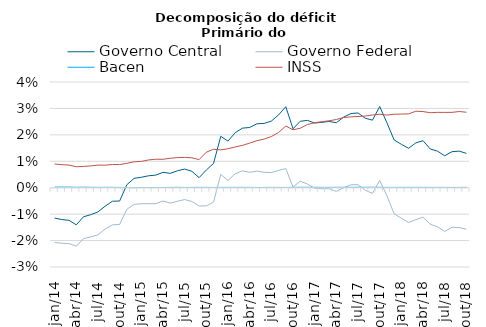
| Category | Governo Central | Governo Federal | Bacen | INSS |
|---|---|---|---|---|
| jan/14 | -0.011 | -0.021 | 0 | 0.009 |
| fev/14 | -0.012 | -0.021 | 0 | 0.009 |
| mar/14 | -0.012 | -0.021 | 0 | 0.009 |
| abr/14 | -0.014 | -0.022 | 0 | 0.008 |
| mai/14 | -0.011 | -0.019 | 0 | 0.008 |
| jun/14 | -0.01 | -0.019 | 0 | 0.008 |
| jul/14 | -0.009 | -0.018 | 0 | 0.009 |
| ago/14 | -0.007 | -0.016 | 0 | 0.009 |
| set/14 | -0.005 | -0.014 | 0 | 0.009 |
| out/14 | -0.005 | -0.014 | 0 | 0.009 |
| nov/14 | 0.001 | -0.008 | 0 | 0.009 |
| dez/14 | 0.004 | -0.006 | 0 | 0.01 |
| jan/15 | 0.004 | -0.006 | 0 | 0.01 |
| fev/15 | 0.005 | -0.006 | 0 | 0.011 |
| mar/15 | 0.005 | -0.006 | 0 | 0.011 |
| abr/15 | 0.006 | -0.005 | 0 | 0.011 |
| mai/15 | 0.005 | -0.006 | 0 | 0.011 |
| jun/15 | 0.006 | -0.005 | 0 | 0.011 |
| jul/15 | 0.007 | -0.004 | 0 | 0.011 |
| ago/15 | 0.006 | -0.005 | 0 | 0.011 |
| set/15 | 0.004 | -0.007 | 0 | 0.011 |
| out/15 | 0.007 | -0.007 | 0 | 0.013 |
| nov/15 | 0.009 | -0.005 | 0 | 0.015 |
| dez/15 | 0.019 | 0.005 | 0 | 0.014 |
| jan/16 | 0.018 | 0.003 | 0 | 0.015 |
| fev/16 | 0.021 | 0.005 | 0 | 0.015 |
| mar/16 | 0.023 | 0.006 | 0 | 0.016 |
| abr/16 | 0.023 | 0.006 | 0 | 0.017 |
| mai/16 | 0.024 | 0.006 | 0 | 0.018 |
| jun/16 | 0.024 | 0.006 | 0 | 0.018 |
| jul/16 | 0.025 | 0.006 | 0 | 0.019 |
| ago/16 | 0.028 | 0.007 | 0 | 0.021 |
| set/16 | 0.031 | 0.007 | 0 | 0.023 |
| out/16 | 0.022 | 0 | 0 | 0.022 |
| nov/16 | 0.025 | 0.002 | 0 | 0.022 |
| dez/16 | 0.025 | 0.001 | 0 | 0.024 |
| jan/17 | 0.024 | 0 | 0 | 0.025 |
| fev/17 | 0.025 | 0 | 0 | 0.025 |
| mar/17 | 0.025 | 0 | 0 | 0.025 |
| abr/17 | 0.025 | -0.001 | 0 | 0.026 |
| mai/17 | 0.027 | 0 | 0 | 0.027 |
| jun/17 | 0.028 | 0.001 | 0 | 0.027 |
| jul/17 | 0.028 | 0.001 | 0 | 0.027 |
| ago/17 | 0.026 | -0.001 | 0 | 0.027 |
| set/17 | 0.026 | -0.002 | 0 | 0.028 |
| out/17 | 0.031 | 0.003 | 0 | 0.028 |
| nov/17 | 0.025 | -0.003 | 0 | 0.027 |
| dez/17 | 0.018 | -0.01 | 0 | 0.028 |
| jan/18 | 0.016 | -0.012 | 0 | 0.028 |
| fev/18 | 0.015 | -0.013 | 0 | 0.028 |
| mar/18 | 0.017 | -0.012 | 0 | 0.029 |
| abr/18 | 0.018 | -0.011 | 0 | 0.029 |
| mai/18 | 0.015 | -0.014 | 0 | 0.028 |
| jun/18 | 0.014 | -0.015 | 0 | 0.029 |
| jul/18 | 0.012 | -0.017 | 0 | 0.028 |
| ago/18 | 0.014 | -0.015 | 0 | 0.029 |
| set/18 | 0.014 | -0.015 | 0 | 0.029 |
| out/18 | 0.013 | -0.016 | 0 | 0.029 |